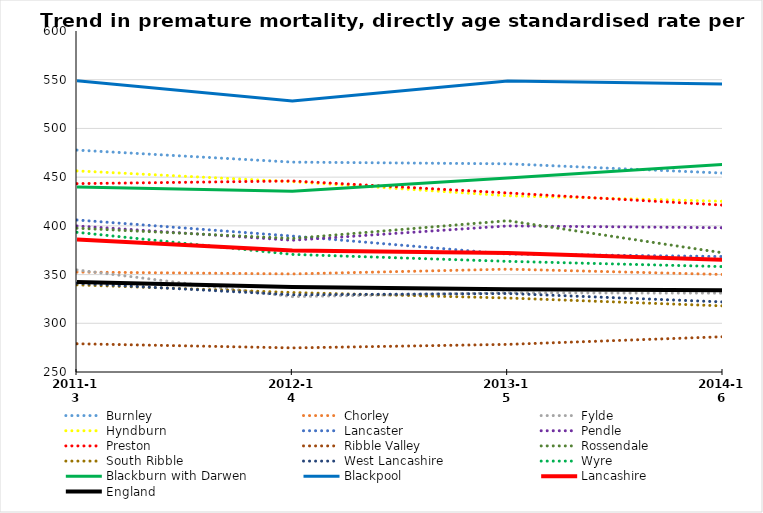
| Category | Burnley | Chorley | Fylde | Hyndburn | Lancaster | Pendle | Preston | Ribble Valley | Rossendale | South Ribble | West Lancashire | Wyre | Blackburn with Darwen | Blackpool | Lancashire | England |
|---|---|---|---|---|---|---|---|---|---|---|---|---|---|---|---|---|
| 2011-13 | 477.756 | 352.558 | 354.758 | 456.411 | 406.024 | 399.894 | 443.348 | 278.979 | 397.599 | 339.443 | 341.054 | 393.39 | 439.928 | 548.863 | 385.93 | 342.494 |
| 2012-14 | 465.419 | 350.669 | 327.333 | 445.378 | 389.52 | 385.232 | 446.082 | 274.742 | 387.031 | 331.565 | 329.218 | 370.688 | 435.567 | 528.154 | 374.683 | 337.13 |
| 2013-15 | 463.684 | 355.56 | 331.328 | 430.893 | 371.09 | 399.932 | 433.746 | 278.338 | 405.299 | 325.95 | 330.554 | 363.574 | 449.06 | 548.651 | 372.267 | 334.965 |
| 2014-16 | 454.158 | 350.107 | 330.925 | 425.21 | 368.482 | 398.081 | 421.308 | 286.201 | 372.283 | 317.839 | 321.908 | 358.176 | 462.926 | 545.656 | 365.165 | 333.84 |